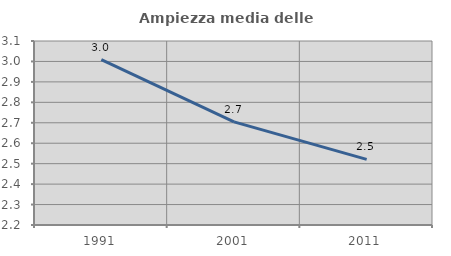
| Category | Ampiezza media delle famiglie |
|---|---|
| 1991.0 | 3.008 |
| 2001.0 | 2.705 |
| 2011.0 | 2.521 |